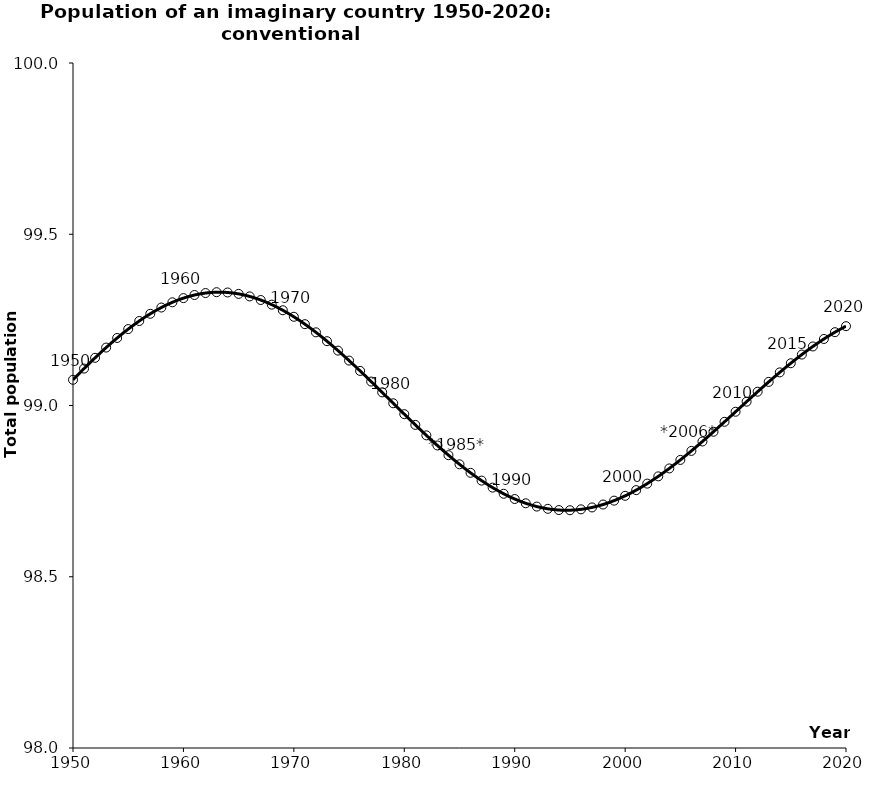
| Category | Series 0 |
|---|---|
| 1950.0 | 99.075 |
| 1951.0 | 99.108 |
| 1952.0 | 99.139 |
| 1953.0 | 99.169 |
| 1954.0 | 99.197 |
| 1955.0 | 99.223 |
| 1956.0 | 99.247 |
| 1957.0 | 99.268 |
| 1958.0 | 99.286 |
| 1959.0 | 99.301 |
| 1960.0 | 99.314 |
| 1961.0 | 99.323 |
| 1962.0 | 99.328 |
| 1963.0 | 99.331 |
| 1964.0 | 99.33 |
| 1965.0 | 99.326 |
| 1966.0 | 99.319 |
| 1967.0 | 99.308 |
| 1968.0 | 99.294 |
| 1969.0 | 99.278 |
| 1970.0 | 99.259 |
| 1971.0 | 99.237 |
| 1972.0 | 99.214 |
| 1973.0 | 99.188 |
| 1974.0 | 99.16 |
| 1975.0 | 99.131 |
| 1976.0 | 99.101 |
| 1977.0 | 99.07 |
| 1978.0 | 99.038 |
| 1979.0 | 99.006 |
| 1980.0 | 98.975 |
| 1981.0 | 98.943 |
| 1982.0 | 98.913 |
| 1983.0 | 98.883 |
| 1984.0 | 98.855 |
| 1985.0 | 98.828 |
| 1986.0 | 98.803 |
| 1987.0 | 98.781 |
| 1988.0 | 98.76 |
| 1989.0 | 98.742 |
| 1990.0 | 98.727 |
| 1991.0 | 98.714 |
| 1992.0 | 98.705 |
| 1993.0 | 98.698 |
| 1994.0 | 98.695 |
| 1995.0 | 98.694 |
| 1996.0 | 98.697 |
| 1997.0 | 98.702 |
| 1998.0 | 98.711 |
| 1999.0 | 98.722 |
| 2000.0 | 98.736 |
| 2001.0 | 98.753 |
| 2002.0 | 98.772 |
| 2003.0 | 98.793 |
| 2004.0 | 98.816 |
| 2005.0 | 98.841 |
| 2006.0 | 98.867 |
| 2007.0 | 98.895 |
| 2008.0 | 98.923 |
| 2009.0 | 98.952 |
| 2010.0 | 98.982 |
| 2011.0 | 99.011 |
| 2012.0 | 99.04 |
| 2013.0 | 99.069 |
| 2014.0 | 99.097 |
| 2015.0 | 99.123 |
| 2016.0 | 99.149 |
| 2017.0 | 99.172 |
| 2018.0 | 99.194 |
| 2019.0 | 99.214 |
| 2020.0 | 99.232 |